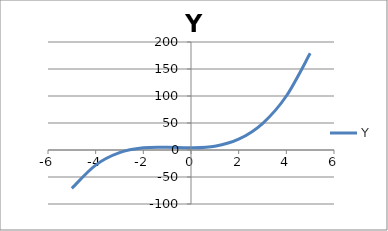
| Category | Y |
|---|---|
| -5.0 | -71 |
| -4.0 | -28 |
| -3.0 | -5 |
| -2.0 | 4 |
| -1.0 | 5 |
| 0.0 | 4 |
| 1.0 | 7 |
| 2.0 | 20 |
| 3.0 | 49 |
| 4.0 | 100 |
| 5.0 | 179 |